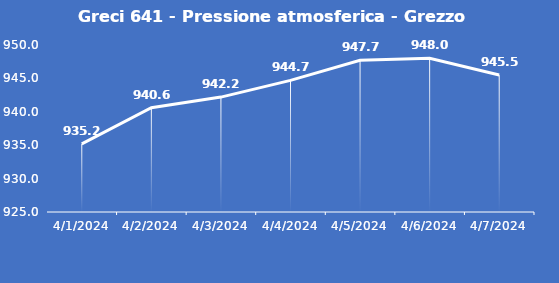
| Category | Greci 641 - Pressione atmosferica - Grezzo (hPa) |
|---|---|
| 4/1/24 | 935.2 |
| 4/2/24 | 940.6 |
| 4/3/24 | 942.2 |
| 4/4/24 | 944.7 |
| 4/5/24 | 947.7 |
| 4/6/24 | 948 |
| 4/7/24 | 945.5 |